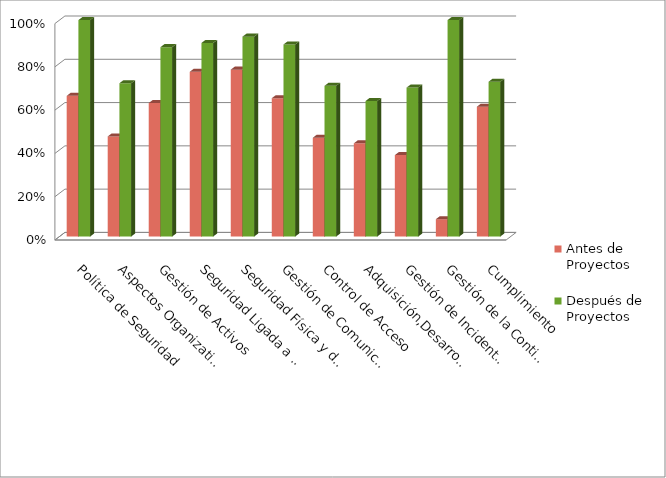
| Category | Antes de Proyectos | Después de Proyectos |
|---|---|---|
| Política de Seguridad | 0.65 | 1 |
| Aspectos Organizativos de la Seguridad de la Información | 0.462 | 0.708 |
| Gestión de Activos | 0.617 | 0.875 |
| Seguridad Ligada a los Recursos Humanos | 0.761 | 0.894 |
| Seguridad Física y del Entorno | 0.771 | 0.923 |
| Gestión de Comunicaciones y Operaciones | 0.639 | 0.887 |
| Control de Acceso | 0.457 | 0.696 |
| Adquisición,Desarrollo y Mantenimiento de Sistemas de Información | 0.431 | 0.626 |
| Gestión de Incidentes de Seguridad de la Información | 0.376 | 0.688 |
| Gestión de la Continuidad del Negocio | 0.08 | 1 |
| Cumplimiento | 0.6 | 0.715 |